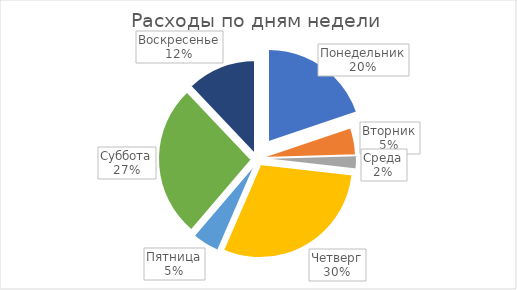
| Category | Series 0 |
|---|---|
| Понедельник | 1150 |
| Вторник | 275 |
| Среда | 130 |
| Четверг | 1725 |
| Пятница | 275 |
| Суббота | 1550 |
| Воскресенье | 700 |